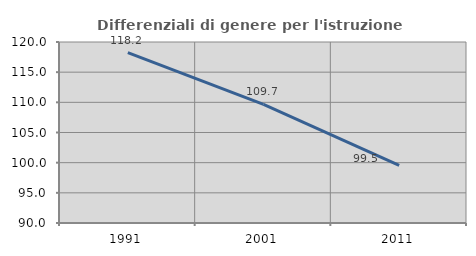
| Category | Differenziali di genere per l'istruzione superiore |
|---|---|
| 1991.0 | 118.249 |
| 2001.0 | 109.656 |
| 2011.0 | 99.543 |